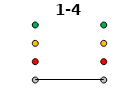
| Category | 0 | 1 | 2 | 3 | 1-4 |
|---|---|---|---|---|---|
| Time 1 | 0 | 1 | 2 | 3 | 0 |
| Time 2 | 0 | 1 | 2 | 3 | 0 |